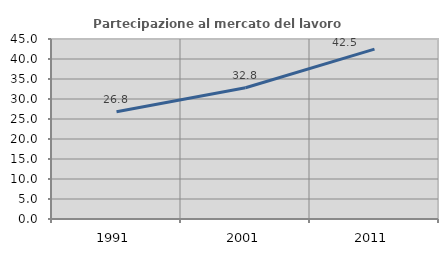
| Category | Partecipazione al mercato del lavoro  femminile |
|---|---|
| 1991.0 | 26.796 |
| 2001.0 | 32.808 |
| 2011.0 | 42.469 |